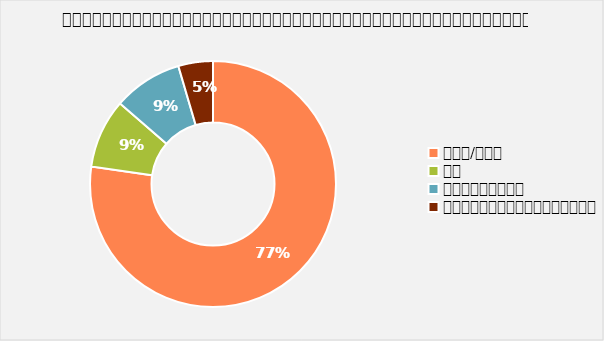
| Category | ភាគរយ |
|---|---|
| បាទ/ចាស | 0.773 |
| ទេ | 0.091 |
| មិនស្គាល់ | 0.091 |
| មិនអាចអនុវត្តបាន។ | 0.045 |